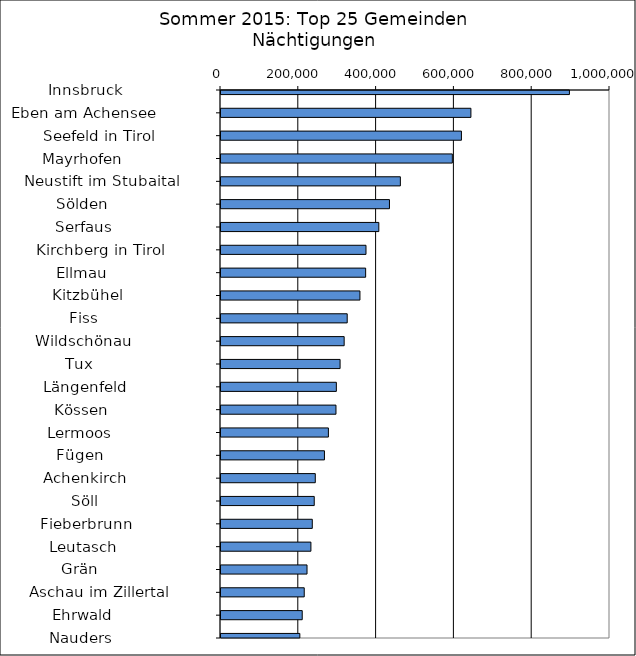
| Category | Series 0 |
|---|---|
|   Innsbruck                  | 895723 |
|   Eben am Achensee           | 642459 |
|   Seefeld in Tirol           | 618064 |
|   Mayrhofen                  | 594696 |
|   Neustift im Stubaital      | 461109 |
|   Sölden                     | 433049 |
|   Serfaus                    | 405691 |
|   Kirchberg in Tirol         | 372719 |
|   Ellmau                     | 371837 |
|   Kitzbühel                  | 357188 |
|   Fiss                       | 324452 |
|   Wildschönau                | 316602 |
|   Tux                        | 306115 |
|   Längenfeld                 | 296520 |
|   Kössen                     | 295580 |
|   Lermoos                    | 276085 |
|   Fügen                      | 265944 |
|   Achenkirch                 | 242386 |
|   Söll                       | 239686 |
|   Fieberbrunn                | 234664 |
|   Leutasch                   | 231137 |
|   Grän                       | 221133 |
|   Aschau im Zillertal        | 213971 |
|   Ehrwald                    | 208815 |
|   Nauders                    | 202662 |